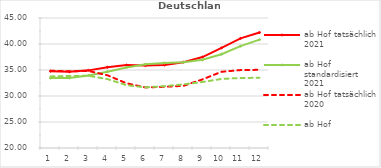
| Category | ab Hof tatsächlich 2021 | ab Hof standardisiert 2021 | ab Hof tatsächlich 2020 | ab Hof standardisiert 2020 |
|---|---|---|---|---|
| 0 | 34.762 | 33.44 | 34.881 | 33.767 |
| 1 | 34.664 | 33.462 | 34.745 | 33.844 |
| 2 | 34.929 | 33.94 | 34.821 | 33.893 |
| 3 | 35.534 | 34.679 | 33.98 | 33.25 |
| 4 | 35.941 | 35.499 | 32.444 | 32.08 |
| 5 | 35.845 | 36.108 | 31.65 | 31.663 |
| 6 | 35.947 | 36.367 | 31.77 | 31.893 |
| 7 | 36.499 | 36.487 | 31.96 | 32.246 |
| 8 | 37.491 | 36.971 | 33.193 | 32.695 |
| 9 | 39.257 | 38.031 | 34.654 | 33.281 |
| 10 | 41.076 | 39.583 | 34.983 | 33.468 |
| 11 | 42.22 | 40.837 | 35.038 | 33.5 |